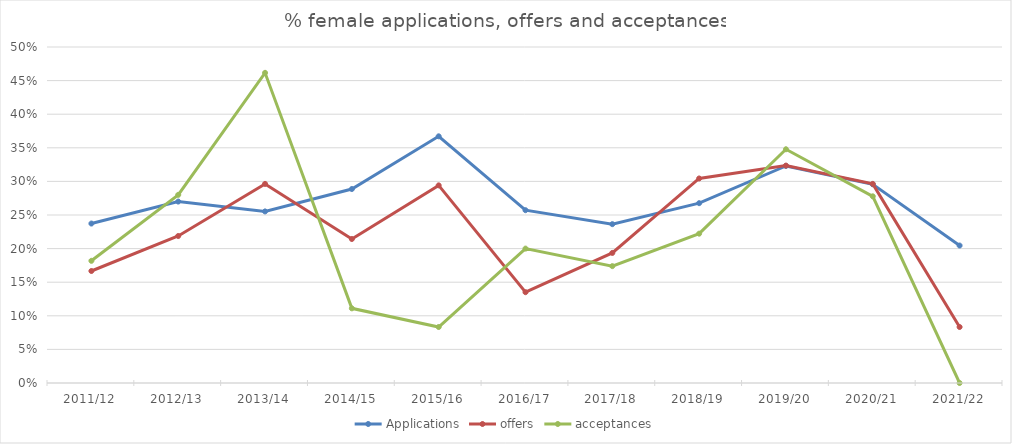
| Category | Applications | offers | acceptances |
|---|---|---|---|
| 2011/12 | 0.237 | 0.167 | 0.182 |
| 2012/13 | 0.27 | 0.219 | 0.28 |
| 2013/14 | 0.255 | 0.296 | 0.462 |
| 2014/15 | 0.289 | 0.214 | 0.111 |
| 2015/16 | 0.367 | 0.294 | 0.083 |
| 2016/17 | 0.257 | 0.135 | 0.2 |
| 2017/18 | 0.236 | 0.194 | 0.174 |
| 2018/19 | 0.268 | 0.304 | 0.222 |
| 2019/20 | 0.323 | 0.324 | 0.348 |
| 2020/21 | 0.296 | 0.296 | 0.278 |
| 2021/22 | 0.205 | 0.083 | 0 |